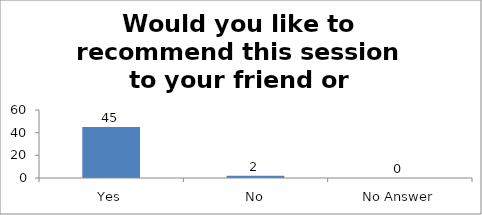
| Category | Would you like to recommend this session to your friend or colleague? |
|---|---|
| Yes | 45 |
| No | 2 |
| No Answer | 0 |